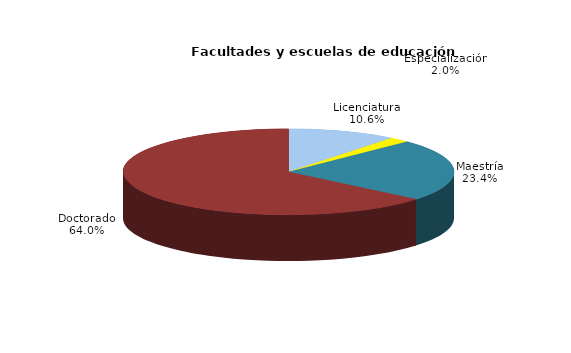
| Category | Series 0 |
|---|---|
| Licenciatura | 430 |
| Especialización | 82 |
| Maestría | 950 |
| Doctorado | 2598 |